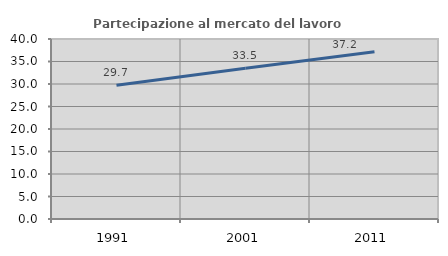
| Category | Partecipazione al mercato del lavoro  femminile |
|---|---|
| 1991.0 | 29.726 |
| 2001.0 | 33.485 |
| 2011.0 | 37.165 |